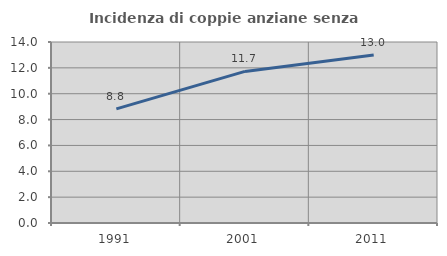
| Category | Incidenza di coppie anziane senza figli  |
|---|---|
| 1991.0 | 8.824 |
| 2001.0 | 11.724 |
| 2011.0 | 12.987 |